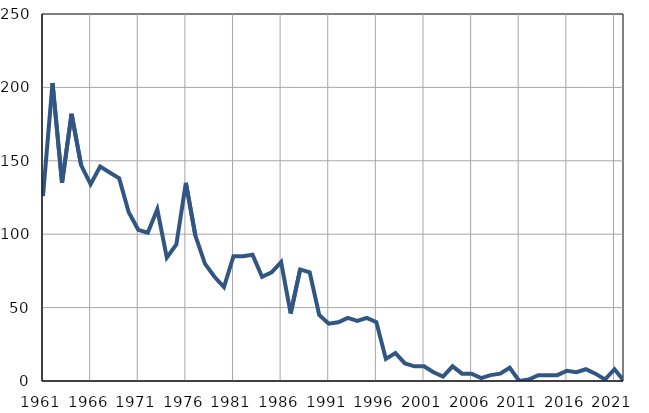
| Category | Infants
deaths |
|---|---|
| 1961.0 | 126 |
| 1962.0 | 203 |
| 1963.0 | 135 |
| 1964.0 | 182 |
| 1965.0 | 147 |
| 1966.0 | 134 |
| 1967.0 | 146 |
| 1968.0 | 142 |
| 1969.0 | 138 |
| 1970.0 | 115 |
| 1971.0 | 103 |
| 1972.0 | 101 |
| 1973.0 | 117 |
| 1974.0 | 84 |
| 1975.0 | 93 |
| 1976.0 | 135 |
| 1977.0 | 99 |
| 1978.0 | 80 |
| 1979.0 | 71 |
| 1980.0 | 64 |
| 1981.0 | 85 |
| 1982.0 | 85 |
| 1983.0 | 86 |
| 1984.0 | 71 |
| 1985.0 | 74 |
| 1986.0 | 81 |
| 1987.0 | 46 |
| 1988.0 | 76 |
| 1989.0 | 74 |
| 1990.0 | 45 |
| 1991.0 | 39 |
| 1992.0 | 40 |
| 1993.0 | 43 |
| 1994.0 | 41 |
| 1995.0 | 43 |
| 1996.0 | 40 |
| 1997.0 | 15 |
| 1998.0 | 19 |
| 1999.0 | 12 |
| 2000.0 | 10 |
| 2001.0 | 10 |
| 2002.0 | 6 |
| 2003.0 | 3 |
| 2004.0 | 10 |
| 2005.0 | 5 |
| 2006.0 | 5 |
| 2007.0 | 2 |
| 2008.0 | 4 |
| 2009.0 | 5 |
| 2010.0 | 9 |
| 2011.0 | 0 |
| 2012.0 | 1 |
| 2013.0 | 4 |
| 2014.0 | 4 |
| 2015.0 | 4 |
| 2016.0 | 7 |
| 2017.0 | 6 |
| 2018.0 | 8 |
| 2019.0 | 5 |
| 2020.0 | 1 |
| 2021.0 | 8 |
| 2022.0 | 0 |